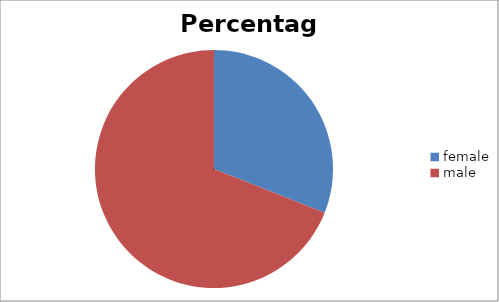
| Category | Percentage |
|---|---|
| female | 31 |
| male | 69 |